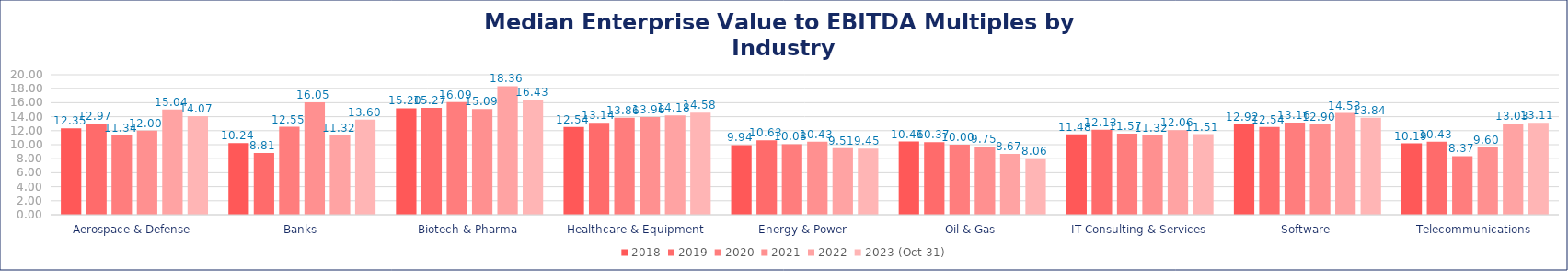
| Category | 2018 | 2019 | 2020 | 2021 | 2022 | 2023 (Oct 31) |
|---|---|---|---|---|---|---|
| Aerospace & Defense | 12.35 | 12.97 | 11.34 | 12 | 15.04 | 14.07 |
| Banks | 10.24 | 8.81 | 12.55 | 16.05 | 11.32 | 13.6 |
| Biotech & Pharma | 15.2 | 15.27 | 16.09 | 15.09 | 18.36 | 16.43 |
| Healthcare & Equipment | 12.54 | 13.14 | 13.86 | 13.96 | 14.18 | 14.58 |
| Energy & Power | 9.94 | 10.63 | 10.08 | 10.43 | 9.51 | 9.45 |
| Oil & Gas | 10.46 | 10.37 | 10 | 9.75 | 8.67 | 8.06 |
| IT Consulting & Services | 11.48 | 12.13 | 11.57 | 11.32 | 12.06 | 11.51 |
| Software | 12.92 | 12.54 | 13.16 | 12.9 | 14.53 | 13.84 |
| Telecommunications | 10.19 | 10.43 | 8.37 | 9.6 | 13.03 | 13.11 |